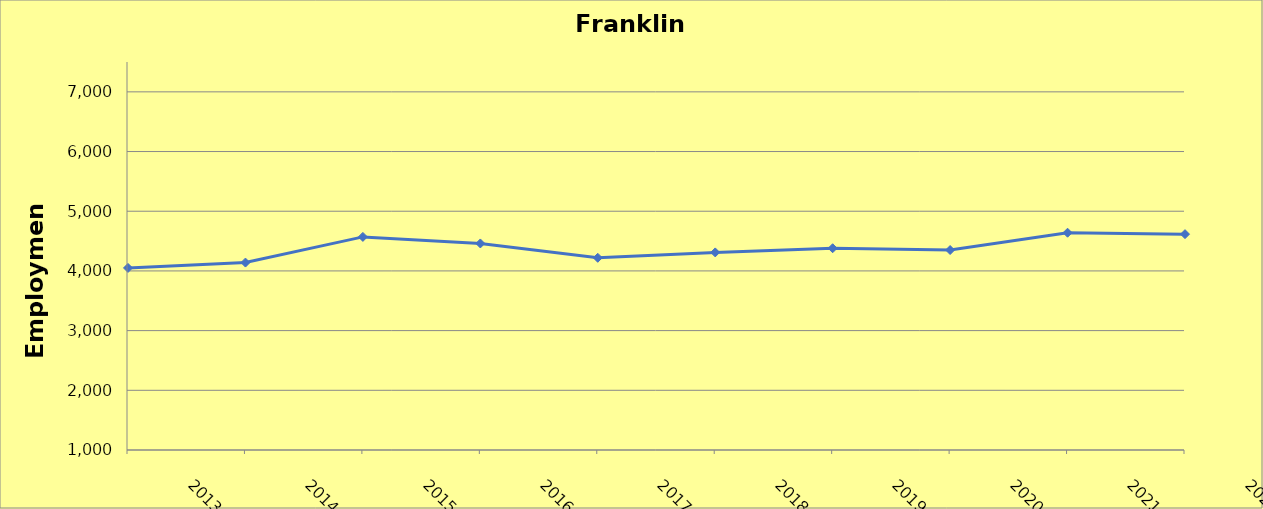
| Category | Franklin County |
|---|---|
| 2013.0 | 4050 |
| 2014.0 | 4140 |
| 2015.0 | 4570 |
| 2016.0 | 4460 |
| 2017.0 | 4220 |
| 2018.0 | 4310 |
| 2019.0 | 4380 |
| 2020.0 | 4350 |
| 2021.0 | 4640 |
| 2022.0 | 4616 |